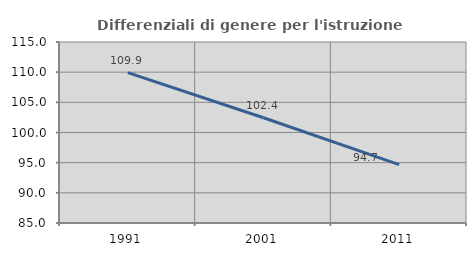
| Category | Differenziali di genere per l'istruzione superiore |
|---|---|
| 1991.0 | 109.927 |
| 2001.0 | 102.443 |
| 2011.0 | 94.679 |